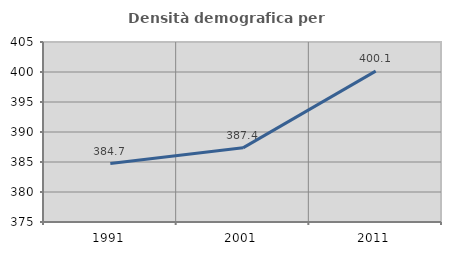
| Category | Densità demografica |
|---|---|
| 1991.0 | 384.747 |
| 2001.0 | 387.358 |
| 2011.0 | 400.147 |